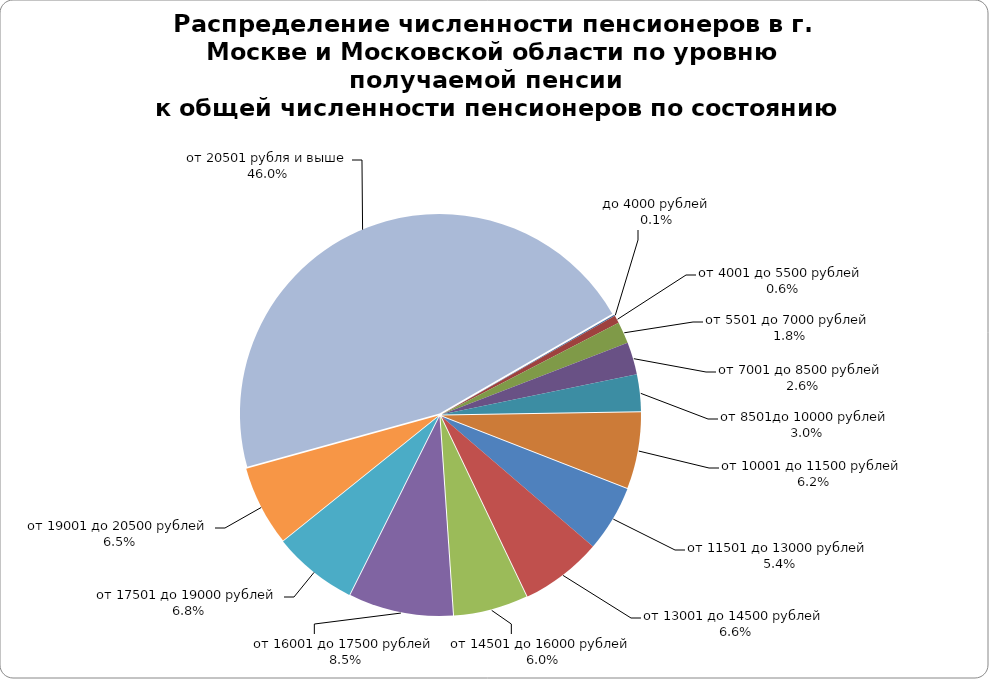
| Category | 0,1% 0,6% 1,8% 2,6% 3,0% 6,2% 5,4% 6,6% 6,0% 8,5% 6,8% 6,5% 46,0% | до 4000 рублей от 4001 до 5500 рублей от 5501 до 7000 рублей от 7001 до 8500 рублей от 8501до 10000 рублей от 10001 до 11500 рублей от 11501 до 13000 рублей от 13001 до 14500 рублей от 14501 до 16000 рублей от 16001 до 17500 рублей от 17501 до 19000 рубле |
|---|---|---|
| до 4000 рублей | 0.001 |  |
| от 4001 до 5500 рублей | 0.006 |  |
| от 5501 до 7000 рублей | 0.018 |  |
| от 7001 до 8500 рублей | 0.026 |  |
| от 8501до 10000 рублей | 0.03 |  |
| от 10001 до 11500 рублей | 0.062 |  |
| от 11501 до 13000 рублей | 0.054 |  |
| от 13001 до 14500 рублей | 0.066 |  |
| от 14501 до 16000 рублей | 0.06 |  |
| от 16001 до 17500 рублей | 0.085 |  |
| от 17501 до 19000 рублей | 0.068 |  |
| от 19001 до 20500 рублей | 0.065 |  |
| от 20501 рубля и выше | 0.46 |  |